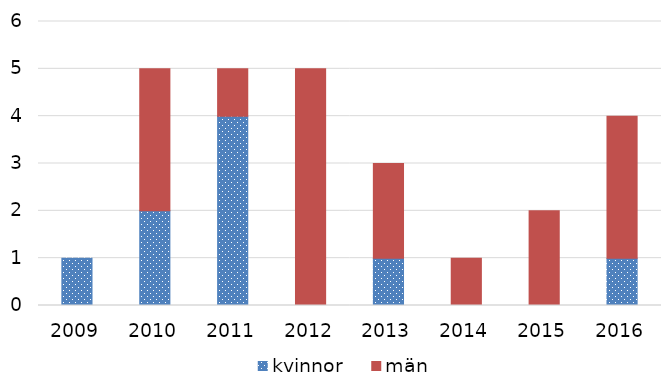
| Category | kvinnor | män |
|---|---|---|
| 2009 | 1 | 0 |
| 2010 | 2 | 3 |
| 2011 | 4 | 1 |
| 2012 | 0 | 5 |
| 2013 | 1 | 2 |
| 2014 | 0 | 1 |
| 2015 | 0 | 2 |
| 2016 | 1 | 3 |